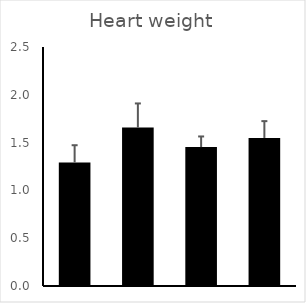
| Category | HW |
|---|---|
| 0 | 1.292 |
| 1 | 1.657 |
| 2 | 1.453 |
| 3 | 1.548 |